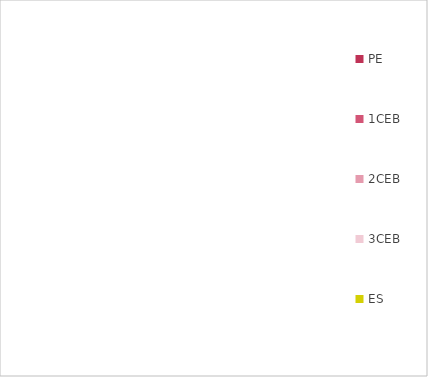
| Category | Series 0 |
|---|---|
| PE | 0 |
| 1CEB | 0 |
| 2CEB | 0 |
| 3CEB | 0 |
| ES | 0 |